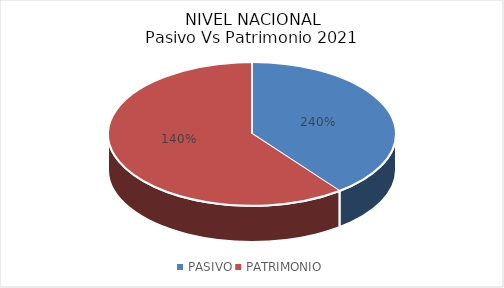
| Category | Series 0 |
|---|---|
| PASIVO | 1756073100018.855 |
| PATRIMONIO | -1023212901432.74 |